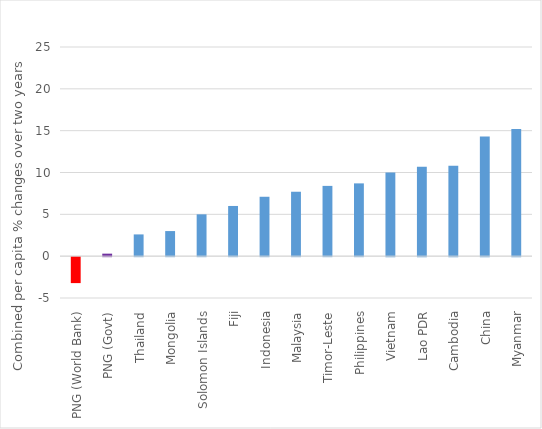
| Category | 2014 and 2015 combined per capita income (non-resource GDP where available or GDP) percentage changes |
|---|---|
| PNG (World Bank) | -3.1 |
| PNG (Govt) | 0.3 |
| Thailand | 2.6 |
| Mongolia | 3 |
| Solomon Islands | 5 |
| Fiji | 6 |
| Indonesia | 7.1 |
| Malaysia | 7.7 |
| Timor-Leste | 8.4 |
| Philippines | 8.7 |
| Vietnam | 10 |
| Lao PDR | 10.7 |
| Cambodia | 10.8 |
| China | 14.3 |
| Myanmar | 15.2 |